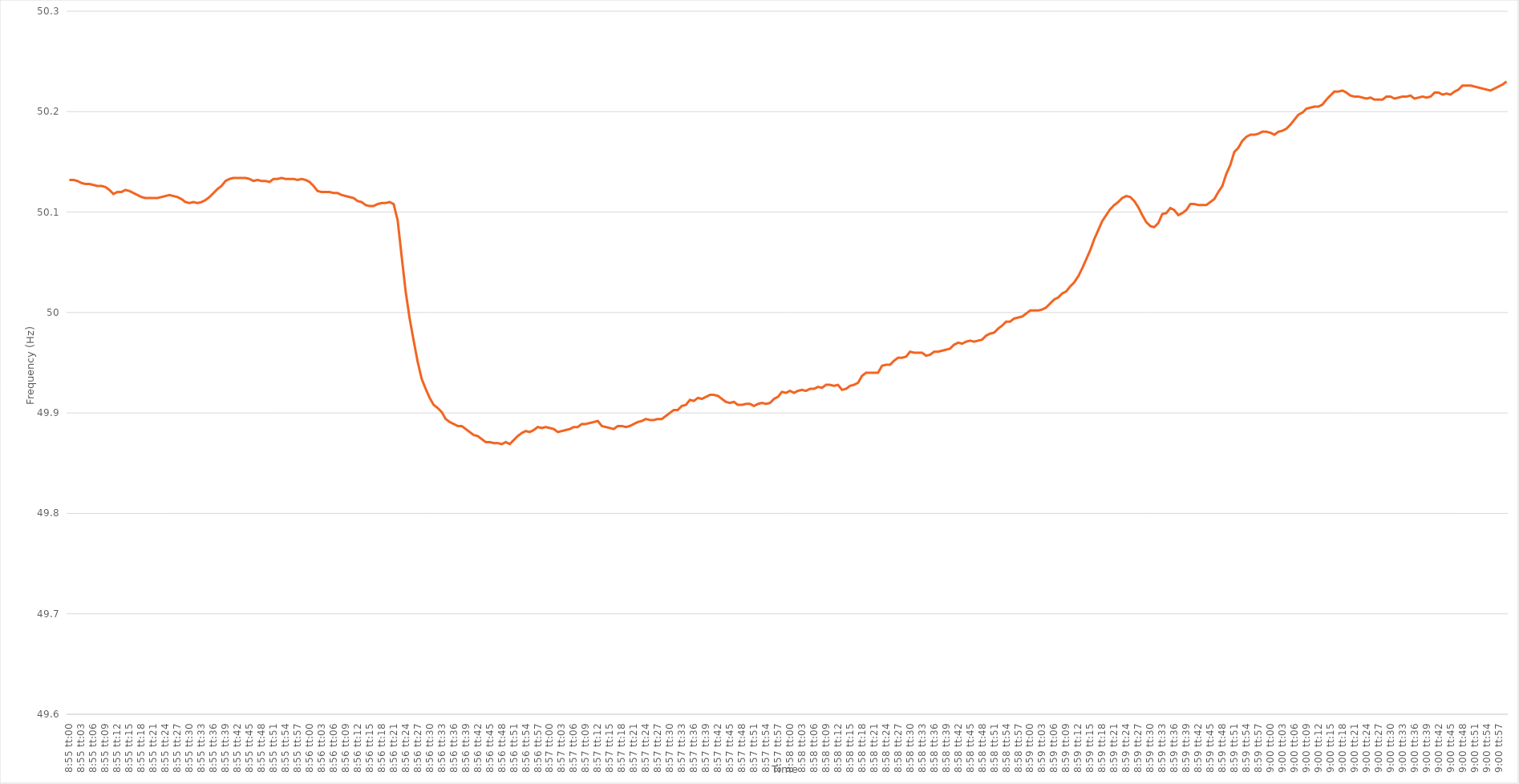
| Category | Series 0 |
|---|---|
| 0.37152777777777773 | 50.132 |
| 0.3715393518518519 | 50.132 |
| 0.3715509259259259 | 50.131 |
| 0.3715625 | 50.129 |
| 0.37157407407407406 | 50.128 |
| 0.37158564814814815 | 50.128 |
| 0.3715972222222222 | 50.127 |
| 0.37160879629629634 | 50.126 |
| 0.3716203703703704 | 50.126 |
| 0.3716319444444445 | 50.125 |
| 0.3716435185185185 | 50.122 |
| 0.3716550925925926 | 50.118 |
| 0.37166666666666665 | 50.12 |
| 0.3716782407407408 | 50.12 |
| 0.37168981481481483 | 50.122 |
| 0.3717013888888889 | 50.121 |
| 0.37171296296296297 | 50.119 |
| 0.371724537037037 | 50.117 |
| 0.3717361111111111 | 50.115 |
| 0.37174768518518514 | 50.114 |
| 0.3717592592592593 | 50.114 |
| 0.37177083333333333 | 50.114 |
| 0.3717824074074074 | 50.114 |
| 0.37179398148148146 | 50.115 |
| 0.37180555555555556 | 50.116 |
| 0.3718171296296296 | 50.117 |
| 0.37182870370370374 | 50.116 |
| 0.3718402777777778 | 50.115 |
| 0.3718518518518519 | 50.113 |
| 0.3718634259259259 | 50.11 |
| 0.371875 | 50.109 |
| 0.37188657407407405 | 50.11 |
| 0.3718981481481482 | 50.109 |
| 0.37190972222222224 | 50.11 |
| 0.37192129629629633 | 50.112 |
| 0.37193287037037037 | 50.115 |
| 0.3719444444444444 | 50.119 |
| 0.3719560185185185 | 50.123 |
| 0.37196759259259254 | 50.126 |
| 0.3719791666666667 | 50.131 |
| 0.37199074074074073 | 50.133 |
| 0.3720023148148148 | 50.134 |
| 0.37201388888888887 | 50.134 |
| 0.37202546296296296 | 50.134 |
| 0.372037037037037 | 50.134 |
| 0.37204861111111115 | 50.133 |
| 0.3720601851851852 | 50.131 |
| 0.3720717592592593 | 50.132 |
| 0.3720833333333333 | 50.131 |
| 0.3720949074074074 | 50.131 |
| 0.37210648148148145 | 50.13 |
| 0.3721180555555556 | 50.133 |
| 0.37212962962962964 | 50.133 |
| 0.37214120370370374 | 50.134 |
| 0.3721527777777778 | 50.133 |
| 0.3721643518518518 | 50.133 |
| 0.3721759259259259 | 50.133 |
| 0.37218749999999995 | 50.132 |
| 0.3721990740740741 | 50.133 |
| 0.37221064814814814 | 50.132 |
| 0.37222222222222223 | 50.13 |
| 0.37223379629629627 | 50.126 |
| 0.37224537037037037 | 50.121 |
| 0.3722569444444444 | 50.12 |
| 0.37226851851851855 | 50.12 |
| 0.3722800925925926 | 50.12 |
| 0.3722916666666667 | 50.119 |
| 0.3723032407407407 | 50.119 |
| 0.3723148148148148 | 50.117 |
| 0.37232638888888886 | 50.116 |
| 0.372337962962963 | 50.115 |
| 0.37234953703703705 | 50.114 |
| 0.37236111111111114 | 50.111 |
| 0.3723726851851852 | 50.11 |
| 0.3723842592592593 | 50.107 |
| 0.3723958333333333 | 50.106 |
| 0.37240740740740735 | 50.106 |
| 0.3724189814814815 | 50.108 |
| 0.37243055555555554 | 50.109 |
| 0.37244212962962964 | 50.109 |
| 0.3724537037037037 | 50.11 |
| 0.37246527777777777 | 50.108 |
| 0.3724768518518518 | 50.092 |
| 0.37248842592592596 | 50.056 |
| 0.3725 | 50.021 |
| 0.3725115740740741 | 49.994 |
| 0.37252314814814813 | 49.972 |
| 0.3725347222222222 | 49.951 |
| 0.37254629629629626 | 49.934 |
| 0.3725578703703704 | 49.924 |
| 0.37256944444444445 | 49.915 |
| 0.37258101851851855 | 49.908 |
| 0.3725925925925926 | 49.905 |
| 0.3726041666666667 | 49.901 |
| 0.3726157407407407 | 49.894 |
| 0.37262731481481487 | 49.891 |
| 0.3726388888888889 | 49.889 |
| 0.37265046296296295 | 49.887 |
| 0.37266203703703704 | 49.887 |
| 0.3726736111111111 | 49.884 |
| 0.3726851851851852 | 49.881 |
| 0.3726967592592592 | 49.878 |
| 0.37270833333333336 | 49.877 |
| 0.3727199074074074 | 49.874 |
| 0.3727314814814815 | 49.871 |
| 0.37274305555555554 | 49.871 |
| 0.37275462962962963 | 49.87 |
| 0.37276620370370367 | 49.87 |
| 0.3727777777777778 | 49.869 |
| 0.37278935185185186 | 49.871 |
| 0.37280092592592595 | 49.869 |
| 0.3728125 | 49.873 |
| 0.3728240740740741 | 49.877 |
| 0.3728356481481481 | 49.88 |
| 0.3728472222222223 | 49.882 |
| 0.3728587962962963 | 49.881 |
| 0.37287037037037035 | 49.883 |
| 0.37288194444444445 | 49.886 |
| 0.3728935185185185 | 49.885 |
| 0.3729050925925926 | 49.886 |
| 0.3729166666666666 | 49.885 |
| 0.37292824074074077 | 49.884 |
| 0.3729398148148148 | 49.881 |
| 0.3729513888888889 | 49.882 |
| 0.37296296296296294 | 49.883 |
| 0.37297453703703703 | 49.884 |
| 0.3729861111111111 | 49.886 |
| 0.3729976851851852 | 49.886 |
| 0.37300925925925926 | 49.889 |
| 0.37302083333333336 | 49.889 |
| 0.3730324074074074 | 49.89 |
| 0.3730439814814815 | 49.891 |
| 0.37305555555555553 | 49.892 |
| 0.3730671296296297 | 49.887 |
| 0.3730787037037037 | 49.886 |
| 0.3730902777777778 | 49.885 |
| 0.37310185185185185 | 49.884 |
| 0.3731134259259259 | 49.887 |
| 0.373125 | 49.887 |
| 0.373136574074074 | 49.886 |
| 0.3731481481481482 | 49.887 |
| 0.3731597222222222 | 49.889 |
| 0.3731712962962963 | 49.891 |
| 0.37318287037037035 | 49.892 |
| 0.37319444444444444 | 49.894 |
| 0.3732060185185185 | 49.893 |
| 0.37321759259259263 | 49.893 |
| 0.37322916666666667 | 49.894 |
| 0.37324074074074076 | 49.894 |
| 0.3732523148148148 | 49.897 |
| 0.3732638888888889 | 49.9 |
| 0.37327546296296293 | 49.903 |
| 0.3732870370370371 | 49.903 |
| 0.3732986111111111 | 49.907 |
| 0.3733101851851852 | 49.908 |
| 0.37332175925925926 | 49.913 |
| 0.37333333333333335 | 49.912 |
| 0.3733449074074074 | 49.915 |
| 0.37335648148148143 | 49.914 |
| 0.3733680555555556 | 49.916 |
| 0.3733796296296296 | 49.918 |
| 0.3733912037037037 | 49.918 |
| 0.37340277777777775 | 49.917 |
| 0.37341435185185184 | 49.914 |
| 0.3734259259259259 | 49.911 |
| 0.37343750000000003 | 49.91 |
| 0.37344907407407407 | 49.911 |
| 0.37346064814814817 | 49.908 |
| 0.3734722222222222 | 49.908 |
| 0.3734837962962963 | 49.909 |
| 0.37349537037037034 | 49.909 |
| 0.3735069444444445 | 49.907 |
| 0.3735185185185185 | 49.909 |
| 0.3735300925925926 | 49.91 |
| 0.37354166666666666 | 49.909 |
| 0.37355324074074076 | 49.91 |
| 0.3735648148148148 | 49.914 |
| 0.37357638888888894 | 49.916 |
| 0.373587962962963 | 49.921 |
| 0.373599537037037 | 49.92 |
| 0.3736111111111111 | 49.922 |
| 0.37362268518518515 | 49.92 |
| 0.37363425925925925 | 49.922 |
| 0.3736458333333333 | 49.923 |
| 0.37365740740740744 | 49.922 |
| 0.3736689814814815 | 49.924 |
| 0.37368055555555557 | 49.924 |
| 0.3736921296296296 | 49.926 |
| 0.3737037037037037 | 49.925 |
| 0.37371527777777774 | 49.928 |
| 0.3737268518518519 | 49.928 |
| 0.37373842592592593 | 49.927 |
| 0.37375 | 49.928 |
| 0.37376157407407407 | 49.923 |
| 0.37377314814814816 | 49.924 |
| 0.3737847222222222 | 49.927 |
| 0.37379629629629635 | 49.928 |
| 0.3738078703703704 | 49.93 |
| 0.3738194444444444 | 49.937 |
| 0.3738310185185185 | 49.94 |
| 0.37384259259259256 | 49.94 |
| 0.37385416666666665 | 49.94 |
| 0.3738657407407407 | 49.94 |
| 0.37387731481481484 | 49.947 |
| 0.3738888888888889 | 49.948 |
| 0.373900462962963 | 49.948 |
| 0.373912037037037 | 49.952 |
| 0.3739236111111111 | 49.955 |
| 0.37393518518518515 | 49.955 |
| 0.3739467592592593 | 49.956 |
| 0.37395833333333334 | 49.961 |
| 0.37396990740740743 | 49.96 |
| 0.37398148148148147 | 49.96 |
| 0.37399305555555556 | 49.96 |
| 0.3740046296296296 | 49.957 |
| 0.37401620370370375 | 49.958 |
| 0.3740277777777778 | 49.961 |
| 0.3740393518518519 | 49.961 |
| 0.3740509259259259 | 49.962 |
| 0.37406249999999996 | 49.963 |
| 0.37407407407407406 | 49.964 |
| 0.3740856481481481 | 49.968 |
| 0.37409722222222225 | 49.97 |
| 0.3741087962962963 | 49.969 |
| 0.3741203703703704 | 49.971 |
| 0.3741319444444444 | 49.972 |
| 0.3741435185185185 | 49.971 |
| 0.37415509259259255 | 49.972 |
| 0.3741666666666667 | 49.973 |
| 0.37417824074074074 | 49.977 |
| 0.37418981481481484 | 49.979 |
| 0.3742013888888889 | 49.98 |
| 0.37421296296296297 | 49.984 |
| 0.374224537037037 | 49.987 |
| 0.37423611111111116 | 49.991 |
| 0.3742476851851852 | 49.991 |
| 0.3742592592592593 | 49.994 |
| 0.37427083333333333 | 49.995 |
| 0.3742824074074074 | 49.996 |
| 0.37429398148148146 | 49.999 |
| 0.3743055555555555 | 50.002 |
| 0.37431712962962965 | 50.002 |
| 0.3743287037037037 | 50.002 |
| 0.3743402777777778 | 50.003 |
| 0.3743518518518518 | 50.005 |
| 0.3743634259259259 | 50.009 |
| 0.37437499999999996 | 50.013 |
| 0.3743865740740741 | 50.015 |
| 0.37439814814814815 | 50.019 |
| 0.37440972222222224 | 50.021 |
| 0.3744212962962963 | 50.026 |
| 0.3744328703703704 | 50.03 |
| 0.3744444444444444 | 50.036 |
| 0.37445601851851856 | 50.044 |
| 0.3744675925925926 | 50.053 |
| 0.3744791666666667 | 50.062 |
| 0.37449074074074074 | 50.073 |
| 0.37450231481481483 | 50.082 |
| 0.37451388888888887 | 50.091 |
| 0.374525462962963 | 50.097 |
| 0.37453703703703706 | 50.103 |
| 0.3745486111111111 | 50.107 |
| 0.3745601851851852 | 50.11 |
| 0.37457175925925923 | 50.114 |
| 0.3745833333333333 | 50.116 |
| 0.37459490740740736 | 50.115 |
| 0.3746064814814815 | 50.111 |
| 0.37461805555555555 | 50.105 |
| 0.37462962962962965 | 50.097 |
| 0.3746412037037037 | 50.09 |
| 0.3746527777777778 | 50.086 |
| 0.3746643518518518 | 50.085 |
| 0.37467592592592597 | 50.089 |
| 0.3746875 | 50.098 |
| 0.3746990740740741 | 50.099 |
| 0.37471064814814814 | 50.104 |
| 0.37472222222222223 | 50.102 |
| 0.3747337962962963 | 50.097 |
| 0.3747453703703704 | 50.099 |
| 0.37475694444444446 | 50.102 |
| 0.3747685185185185 | 50.108 |
| 0.3747800925925926 | 50.108 |
| 0.37479166666666663 | 50.107 |
| 0.37480324074074073 | 50.107 |
| 0.37481481481481477 | 50.107 |
| 0.3748263888888889 | 50.11 |
| 0.37483796296296296 | 50.113 |
| 0.37484953703703705 | 50.12 |
| 0.3748611111111111 | 50.126 |
| 0.3748726851851852 | 50.138 |
| 0.3748842592592592 | 50.147 |
| 0.3748958333333334 | 50.16 |
| 0.3749074074074074 | 50.164 |
| 0.3749189814814815 | 50.171 |
| 0.37493055555555554 | 50.175 |
| 0.37494212962962964 | 50.177 |
| 0.3749537037037037 | 50.177 |
| 0.37496527777777783 | 50.178 |
| 0.37497685185185187 | 50.18 |
| 0.37498842592592596 | 50.18 |
| 0.375 | 50.179 |
| 0.37501157407407404 | 50.177 |
| 0.37502314814814813 | 50.18 |
| 0.37503472222222217 | 50.181 |
| 0.3750462962962963 | 50.183 |
| 0.37505787037037036 | 50.187 |
| 0.37506944444444446 | 50.192 |
| 0.3750810185185185 | 50.197 |
| 0.3750925925925926 | 50.199 |
| 0.3751041666666666 | 50.203 |
| 0.3751157407407408 | 50.204 |
| 0.3751273148148148 | 50.205 |
| 0.3751388888888889 | 50.205 |
| 0.37515046296296295 | 50.207 |
| 0.37516203703703704 | 50.212 |
| 0.3751736111111111 | 50.216 |
| 0.37518518518518523 | 50.22 |
| 0.37519675925925927 | 50.22 |
| 0.37520833333333337 | 50.221 |
| 0.3752199074074074 | 50.219 |
| 0.3752314814814815 | 50.216 |
| 0.37524305555555554 | 50.215 |
| 0.3752546296296296 | 50.215 |
| 0.3752662037037037 | 50.214 |
| 0.37527777777777777 | 50.213 |
| 0.37528935185185186 | 50.214 |
| 0.3753009259259259 | 50.212 |
| 0.3753125 | 50.212 |
| 0.37532407407407403 | 50.212 |
| 0.3753356481481482 | 50.215 |
| 0.3753472222222222 | 50.215 |
| 0.3753587962962963 | 50.213 |
| 0.37537037037037035 | 50.214 |
| 0.37538194444444445 | 50.215 |
| 0.3753935185185185 | 50.215 |
| 0.37540509259259264 | 50.216 |
| 0.3754166666666667 | 50.213 |
| 0.37542824074074077 | 50.214 |
| 0.3754398148148148 | 50.215 |
| 0.3754513888888889 | 50.214 |
| 0.37546296296296294 | 50.215 |
| 0.375474537037037 | 50.219 |
| 0.37548611111111113 | 50.219 |
| 0.37549768518518517 | 50.217 |
| 0.37550925925925926 | 50.218 |
| 0.3755208333333333 | 50.217 |
| 0.3755324074074074 | 50.22 |
| 0.37554398148148144 | 50.222 |
| 0.3755555555555556 | 50.226 |
| 0.3755671296296296 | 50.226 |
| 0.3755787037037037 | 50.226 |
| 0.37559027777777776 | 50.225 |
| 0.37560185185185185 | 50.224 |
| 0.3756134259259259 | 50.223 |
| 0.37562500000000004 | 50.222 |
| 0.3756365740740741 | 50.221 |
| 0.3756481481481482 | 50.223 |
| 0.3756597222222222 | 50.225 |
| 0.3756712962962963 | 50.227 |
| 0.37568287037037035 | 50.23 |